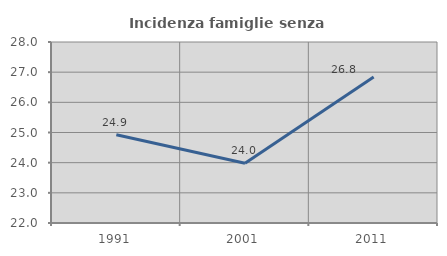
| Category | Incidenza famiglie senza nuclei |
|---|---|
| 1991.0 | 24.924 |
| 2001.0 | 23.98 |
| 2011.0 | 26.843 |